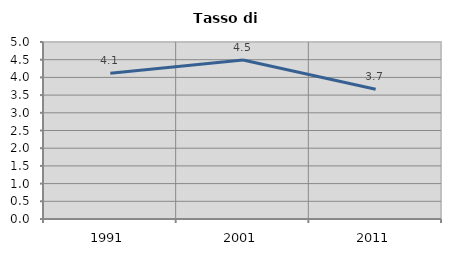
| Category | Tasso di disoccupazione   |
|---|---|
| 1991.0 | 4.115 |
| 2001.0 | 4.49 |
| 2011.0 | 3.667 |